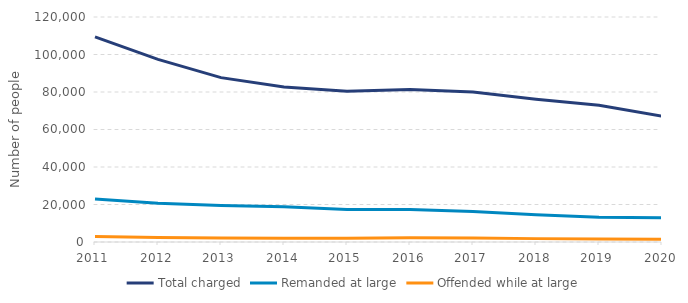
| Category | Total charged | Remanded at large | Offended while at large |
|---|---|---|---|
| 2011.0 | 109360 | 22929 | 2905 |
| 2012.0 | 97426 | 20726 | 2409 |
| 2013.0 | 87652 | 19528 | 2188 |
| 2014.0 | 82681 | 18759 | 2025 |
| 2015.0 | 80384 | 17341 | 2045 |
| 2016.0 | 81320 | 17318 | 2232 |
| 2017.0 | 79985 | 16285 | 2111 |
| 2018.0 | 76190 | 14594 | 1800 |
| 2019.0 | 72899 | 13234 | 1575 |
| 2020.0 | 67109 | 12945 | 1526 |